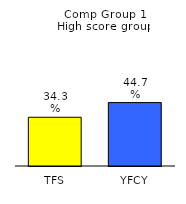
| Category | Series 0 |
|---|---|
| TFS | 0.343 |
| YFCY | 0.447 |